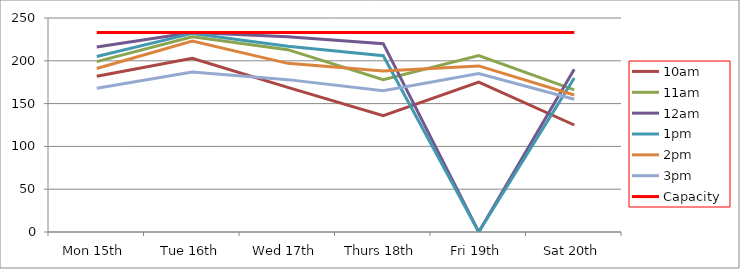
| Category | 9am | 10am | 11am | 12am | 1pm | 2pm | 3pm | 4pm | 5pm | Capacity |
|---|---|---|---|---|---|---|---|---|---|---|
| Mon 15th |  | 182 | 199 | 216 | 205 | 191 | 168 |  |  | 233 |
| Tue 16th |  | 203 | 228 | 233 | 232 | 223 | 187 |  |  | 233 |
| Wed 17th |  | 169 | 213 | 228 | 217 | 197 | 178 |  |  | 233 |
| Thurs 18th |  | 136 | 178 | 220 | 206 | 188 | 165 |  |  | 233 |
| Fri 19th |  | 175 | 206 | 0 | 0 | 194 | 185 |  |  | 233 |
| Sat 20th |  | 125 | 166 | 190 | 180 | 160 | 155 |  |  | 233 |